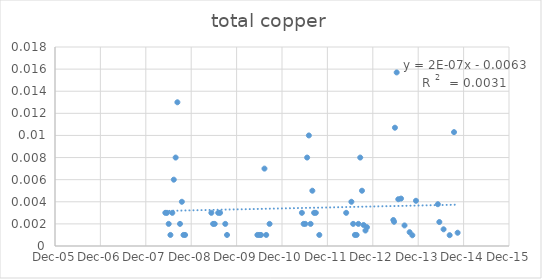
| Category | Series 0 |
|---|---|
| 39577.0 | 0.003 |
| 39590.0 | 0.003 |
| 39604.0 | 0.002 |
| 39618.0 | 0.001 |
| 39633.0 | 0.003 |
| 39645.0 | 0.006 |
| 39660.0 | 0.008 |
| 39674.0 | 0.013 |
| 39695.0 | 0.002 |
| 39710.0 | 0.004 |
| 39723.0 | 0.001 |
| 39736.0 | 0.001 |
| 39947.0 | 0.003 |
| 39961.0 | 0.002 |
| 39974.0 | 0.002 |
| 40002.0 | 0.003 |
| 40017.0 | 0.003 |
| 40059.0 | 0.002 |
| 40073.0 | 0.001 |
| 40317.0 | 0.001 |
| 40332.0 | 0.001 |
| 40346.0 | 0.001 |
| 40374.0 | 0.007 |
| 40388.0 | 0.001 |
| 40415.0 | 0.002 |
| 40675.0 | 0.003 |
| 40689.0 | 0.002 |
| 40702.0 | 0.002 |
| 40717.0 | 0.008 |
| 40731.0 | 0.01 |
| 40745.0 | 0.002 |
| 40759.0 | 0.005 |
| 40773.0 | 0.003 |
| 40787.0 | 0.003 |
| 40815.0 | 0.001 |
| 41031.0 | 0.003 |
| 41073.0 | 0.004 |
| 41087.0 | 0.002 |
| 41101.0 | 0.001 |
| 41115.0 | 0.001 |
| 41129.0 | 0.002 |
| 41144.0 | 0.008 |
| 41158.0 | 0.005 |
| 41171.0 | 0.002 |
| 41186.0 | 0.001 |
| 41198.0 | 0.002 |
| 41410.0 | 0.002 |
| 41416.0 | 0.002 |
| 41423.0 | 0.011 |
| 41437.0 | 0.016 |
| 41450.0 | 0.004 |
| 41472.0 | 0.004 |
| 41500.0 | 0.002 |
| 41541.0 | 0.001 |
| 41563.0 | 0.001 |
| 41592.0 | 0.004 |
| 41768.0 | 0.004 |
| 41780.0 | 0.002 |
| 41814.0 | 0.002 |
| 41863.0 | 0.001 |
| 41898.0 | 0.01 |
| 41927.0 | 0.001 |